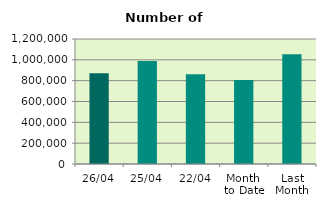
| Category | Series 0 |
|---|---|
| 26/04 | 871610 |
| 25/04 | 989476 |
| 22/04 | 861156 |
| Month 
to Date | 806488 |
| Last
Month | 1053589.478 |